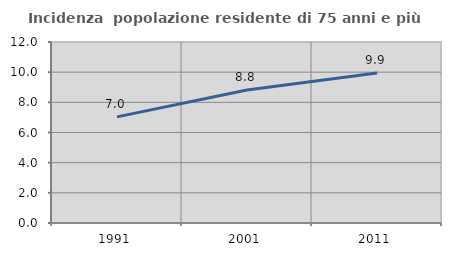
| Category | Incidenza  popolazione residente di 75 anni e più |
|---|---|
| 1991.0 | 7.036 |
| 2001.0 | 8.82 |
| 2011.0 | 9.949 |